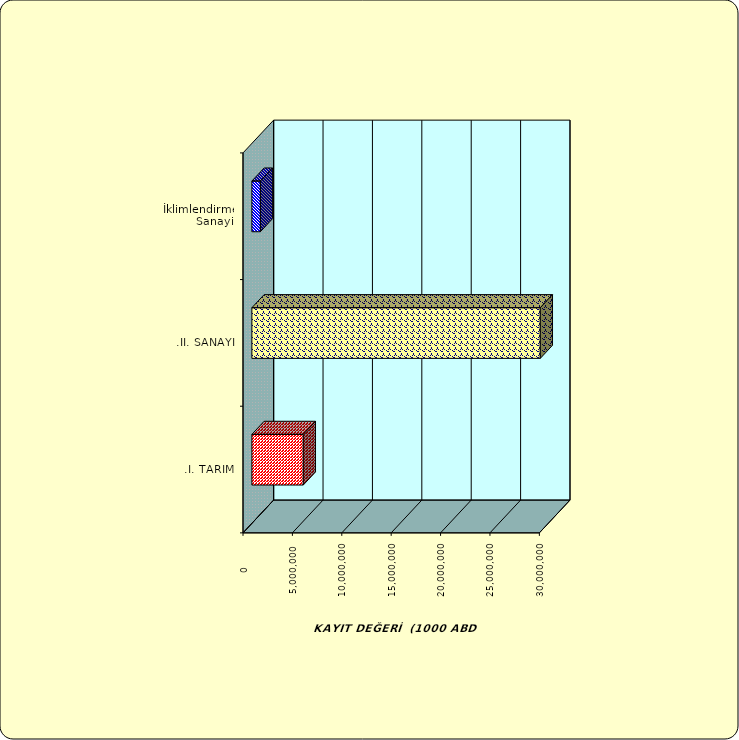
| Category | Series 0 |
|---|---|
| .I. TARIM | 5203224.722 |
| .II. SANAYİ | 29194126.051 |
|  İklimlendirme Sanayii | 860877.98 |